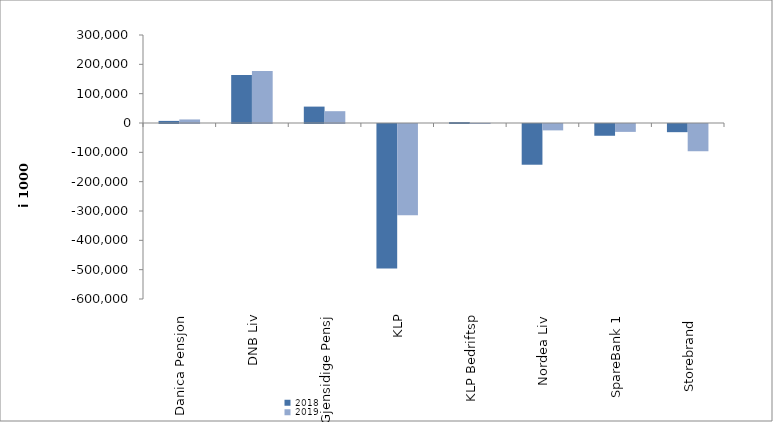
| Category | 2018 | 2019 |
|---|---|---|
| Danica Pensjon | 7172.333 | 12101.765 |
| DNB Liv | 163223 | 177031 |
| Gjensidige Pensj | 55886 | 40284 |
| KLP | -492216.585 | -311467.572 |
| KLP Bedriftsp | 3095 | 517 |
| Nordea Liv | -138834.616 | -21770 |
| SpareBank 1 | -40094.756 | -26898.823 |
| Storebrand  | -27854.513 | -92858.755 |